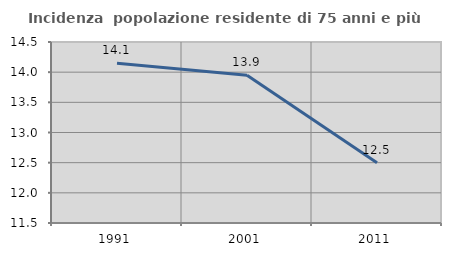
| Category | Incidenza  popolazione residente di 75 anni e più |
|---|---|
| 1991.0 | 14.147 |
| 2001.0 | 13.949 |
| 2011.0 | 12.5 |